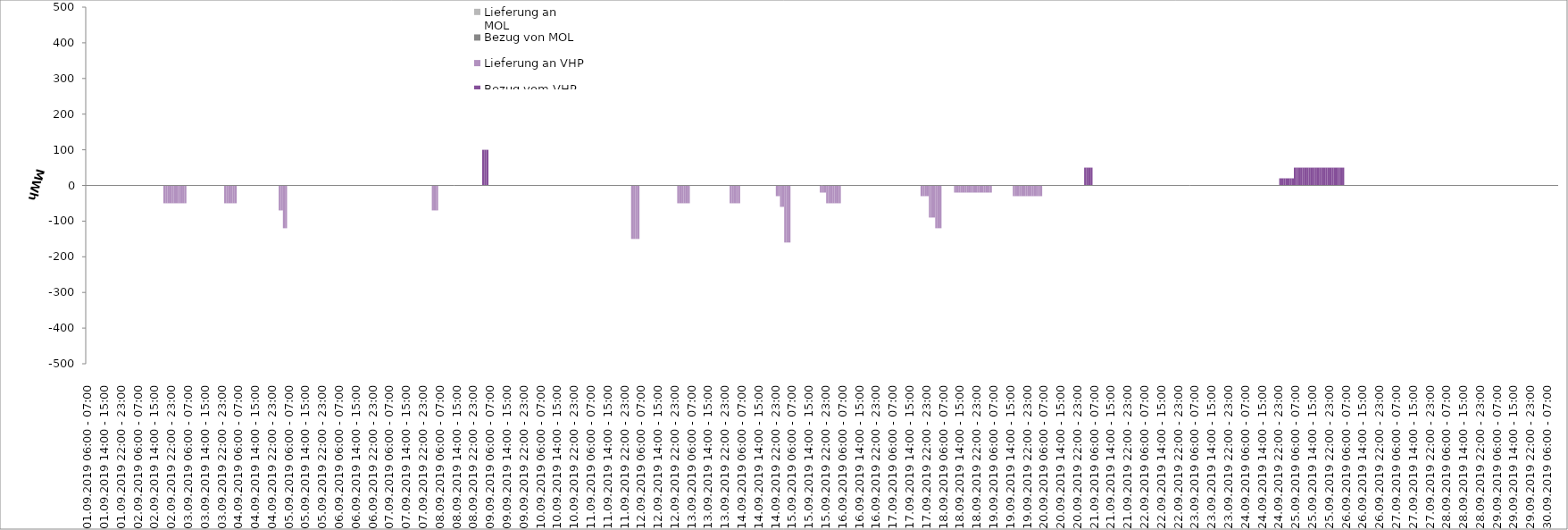
| Category | Bezug vom VHP | Lieferung an VHP | Bezug von MOL | Lieferung an MOL |
|---|---|---|---|---|
| 01.09.2019 06:00 - 07:00 | 0 | 0 | 0 | 0 |
| 01.09.2019 07:00 - 08:00 | 0 | 0 | 0 | 0 |
| 01.09.2019 08:00 - 09:00 | 0 | 0 | 0 | 0 |
| 01.09.2019 09:00 - 10:00 | 0 | 0 | 0 | 0 |
| 01.09.2019 10:00 - 11:00 | 0 | 0 | 0 | 0 |
| 01.09.2019 11:00 - 12:00 | 0 | 0 | 0 | 0 |
| 01.09.2019 12:00 - 13:00 | 0 | 0 | 0 | 0 |
| 01.09.2019 13:00 - 14:00 | 0 | 0 | 0 | 0 |
| 01.09.2019 14:00 - 15:00 | 0 | 0 | 0 | 0 |
| 01.09.2019 15:00 - 16:00 | 0 | 0 | 0 | 0 |
| 01.09.2019 16:00 - 17:00 | 0 | 0 | 0 | 0 |
| 01.09.2019 17:00 - 18:00 | 0 | 0 | 0 | 0 |
| 01.09.2019 18:00 - 19:00 | 0 | 0 | 0 | 0 |
| 01.09.2019 19:00 - 20:00 | 0 | 0 | 0 | 0 |
| 01.09.2019 20:00 - 21:00 | 0 | 0 | 0 | 0 |
| 01.09.2019 21:00 - 22:00 | 0 | 0 | 0 | 0 |
| 01.09.2019 22:00 - 23:00 | 0 | 0 | 0 | 0 |
| 01.09.2019 23:00 - 24:00 | 0 | 0 | 0 | 0 |
| 02.09.2019 00:00 - 01:00 | 0 | 0 | 0 | 0 |
| 02.09.2019 01:00 - 02:00 | 0 | 0 | 0 | 0 |
| 02.09.2019 02:00 - 03:00 | 0 | 0 | 0 | 0 |
| 02.09.2019 03:00 - 04:00 | 0 | 0 | 0 | 0 |
| 02.09.2019 04:00 - 05:00 | 0 | 0 | 0 | 0 |
| 02.09.2019 05:00 - 06:00 | 0 | 0 | 0 | 0 |
| 02.09.2019 06:00 - 07:00 | 0 | 0 | 0 | 0 |
| 02.09.2019 07:00 - 08:00 | 0 | 0 | 0 | 0 |
| 02.09.2019 08:00 - 09:00 | 0 | 0 | 0 | 0 |
| 02.09.2019 09:00 - 10:00 | 0 | 0 | 0 | 0 |
| 02.09.2019 10:00 - 11:00 | 0 | 0 | 0 | 0 |
| 02.09.2019 11:00 - 12:00 | 0 | 0 | 0 | 0 |
| 02.09.2019 12:00 - 13:00 | 0 | 0 | 0 | 0 |
| 02.09.2019 13:00 - 14:00 | 0 | 0 | 0 | 0 |
| 02.09.2019 14:00 - 15:00 | 0 | 0 | 0 | 0 |
| 02.09.2019 15:00 - 16:00 | 0 | 0 | 0 | 0 |
| 02.09.2019 16:00 - 17:00 | 0 | 0 | 0 | 0 |
| 02.09.2019 17:00 - 18:00 | 0 | 0 | 0 | 0 |
| 02.09.2019 18:00 - 19:00 | 0 | 0 | 0 | 0 |
| 02.09.2019 19:00 - 20:00 | 0 | -50 | 0 | 0 |
| 02.09.2019 20:00 - 21:00 | 0 | -50 | 0 | 0 |
| 02.09.2019 21:00 - 22:00 | 0 | -50 | 0 | 0 |
| 02.09.2019 22:00 - 23:00 | 0 | -50 | 0 | 0 |
| 02.09.2019 23:00 - 24:00 | 0 | -50 | 0 | 0 |
| 03.09.2019 00:00 - 01:00 | 0 | -50 | 0 | 0 |
| 03.09.2019 01:00 - 02:00 | 0 | -50 | 0 | 0 |
| 03.09.2019 02:00 - 03:00 | 0 | -50 | 0 | 0 |
| 03.09.2019 03:00 - 04:00 | 0 | -50 | 0 | 0 |
| 03.09.2019 04:00 - 05:00 | 0 | -50 | 0 | 0 |
| 03.09.2019 05:00 - 06:00 | 0 | -50 | 0 | 0 |
| 03.09.2019 06:00 - 07:00 | 0 | 0 | 0 | 0 |
| 03.09.2019 07:00 - 08:00 | 0 | 0 | 0 | 0 |
| 03.09.2019 08:00 - 09:00 | 0 | 0 | 0 | 0 |
| 03.09.2019 09:00 - 10:00 | 0 | 0 | 0 | 0 |
| 03.09.2019 10:00 - 11:00 | 0 | 0 | 0 | 0 |
| 03.09.2019 11:00 - 12:00 | 0 | 0 | 0 | 0 |
| 03.09.2019 12:00 - 13:00 | 0 | 0 | 0 | 0 |
| 03.09.2019 13:00 - 14:00 | 0 | 0 | 0 | 0 |
| 03.09.2019 14:00 - 15:00 | 0 | 0 | 0 | 0 |
| 03.09.2019 15:00 - 16:00 | 0 | 0 | 0 | 0 |
| 03.09.2019 16:00 - 17:00 | 0 | 0 | 0 | 0 |
| 03.09.2019 17:00 - 18:00 | 0 | 0 | 0 | 0 |
| 03.09.2019 18:00 - 19:00 | 0 | 0 | 0 | 0 |
| 03.09.2019 19:00 - 20:00 | 0 | 0 | 0 | 0 |
| 03.09.2019 20:00 - 21:00 | 0 | 0 | 0 | 0 |
| 03.09.2019 21:00 - 22:00 | 0 | 0 | 0 | 0 |
| 03.09.2019 22:00 - 23:00 | 0 | 0 | 0 | 0 |
| 03.09.2019 23:00 - 24:00 | 0 | 0 | 0 | 0 |
| 04.09.2019 00:00 - 01:00 | 0 | -50 | 0 | 0 |
| 04.09.2019 01:00 - 02:00 | 0 | -50 | 0 | 0 |
| 04.09.2019 02:00 - 03:00 | 0 | -50 | 0 | 0 |
| 04.09.2019 03:00 - 04:00 | 0 | -50 | 0 | 0 |
| 04.09.2019 04:00 - 05:00 | 0 | -50 | 0 | 0 |
| 04.09.2019 05:00 - 06:00 | 0 | -50 | 0 | 0 |
| 04.09.2019 06:00 - 07:00 | 0 | 0 | 0 | 0 |
| 04.09.2019 07:00 - 08:00 | 0 | 0 | 0 | 0 |
| 04.09.2019 08:00 - 09:00 | 0 | 0 | 0 | 0 |
| 04.09.2019 09:00 - 10:00 | 0 | 0 | 0 | 0 |
| 04.09.2019 10:00 - 11:00 | 0 | 0 | 0 | 0 |
| 04.09.2019 11:00 - 12:00 | 0 | 0 | 0 | 0 |
| 04.09.2019 12:00 - 13:00 | 0 | 0 | 0 | 0 |
| 04.09.2019 13:00 - 14:00 | 0 | 0 | 0 | 0 |
| 04.09.2019 14:00 - 15:00 | 0 | 0 | 0 | 0 |
| 04.09.2019 15:00 - 16:00 | 0 | 0 | 0 | 0 |
| 04.09.2019 16:00 - 17:00 | 0 | 0 | 0 | 0 |
| 04.09.2019 17:00 - 18:00 | 0 | 0 | 0 | 0 |
| 04.09.2019 18:00 - 19:00 | 0 | 0 | 0 | 0 |
| 04.09.2019 19:00 - 20:00 | 0 | 0 | 0 | 0 |
| 04.09.2019 20:00 - 21:00 | 0 | 0 | 0 | 0 |
| 04.09.2019 21:00 - 22:00 | 0 | 0 | 0 | 0 |
| 04.09.2019 22:00 - 23:00 | 0 | 0 | 0 | 0 |
| 04.09.2019 23:00 - 24:00 | 0 | 0 | 0 | 0 |
| 05.09.2019 00:00 - 01:00 | 0 | 0 | 0 | 0 |
| 05.09.2019 01:00 - 02:00 | 0 | 0 | 0 | 0 |
| 05.09.2019 02:00 - 03:00 | 0 | -70 | 0 | 0 |
| 05.09.2019 03:00 - 04:00 | 0 | -70 | 0 | 0 |
| 05.09.2019 04:00 - 05:00 | 0 | -120 | 0 | 0 |
| 05.09.2019 05:00 - 06:00 | 0 | -120 | 0 | 0 |
| 05.09.2019 06:00 - 07:00 | 0 | 0 | 0 | 0 |
| 05.09.2019 07:00 - 08:00 | 0 | 0 | 0 | 0 |
| 05.09.2019 08:00 - 09:00 | 0 | 0 | 0 | 0 |
| 05.09.2019 09:00 - 10:00 | 0 | 0 | 0 | 0 |
| 05.09.2019 10:00 - 11:00 | 0 | 0 | 0 | 0 |
| 05.09.2019 11:00 - 12:00 | 0 | 0 | 0 | 0 |
| 05.09.2019 12:00 - 13:00 | 0 | 0 | 0 | 0 |
| 05.09.2019 13:00 - 14:00 | 0 | 0 | 0 | 0 |
| 05.09.2019 14:00 - 15:00 | 0 | 0 | 0 | 0 |
| 05.09.2019 15:00 - 16:00 | 0 | 0 | 0 | 0 |
| 05.09.2019 16:00 - 17:00 | 0 | 0 | 0 | 0 |
| 05.09.2019 17:00 - 18:00 | 0 | 0 | 0 | 0 |
| 05.09.2019 18:00 - 19:00 | 0 | 0 | 0 | 0 |
| 05.09.2019 19:00 - 20:00 | 0 | 0 | 0 | 0 |
| 05.09.2019 20:00 - 21:00 | 0 | 0 | 0 | 0 |
| 05.09.2019 21:00 - 22:00 | 0 | 0 | 0 | 0 |
| 05.09.2019 22:00 - 23:00 | 0 | 0 | 0 | 0 |
| 05.09.2019 23:00 - 24:00 | 0 | 0 | 0 | 0 |
| 06.09.2019 00:00 - 01:00 | 0 | 0 | 0 | 0 |
| 06.09.2019 01:00 - 02:00 | 0 | 0 | 0 | 0 |
| 06.09.2019 02:00 - 03:00 | 0 | 0 | 0 | 0 |
| 06.09.2019 03:00 - 04:00 | 0 | 0 | 0 | 0 |
| 06.09.2019 04:00 - 05:00 | 0 | 0 | 0 | 0 |
| 06.09.2019 05:00 - 06:00 | 0 | 0 | 0 | 0 |
| 06.09.2019 06:00 - 07:00 | 0 | 0 | 0 | 0 |
| 06.09.2019 07:00 - 08:00 | 0 | 0 | 0 | 0 |
| 06.09.2019 08:00 - 09:00 | 0 | 0 | 0 | 0 |
| 06.09.2019 09:00 - 10:00 | 0 | 0 | 0 | 0 |
| 06.09.2019 10:00 - 11:00 | 0 | 0 | 0 | 0 |
| 06.09.2019 11:00 - 12:00 | 0 | 0 | 0 | 0 |
| 06.09.2019 12:00 - 13:00 | 0 | 0 | 0 | 0 |
| 06.09.2019 13:00 - 14:00 | 0 | 0 | 0 | 0 |
| 06.09.2019 14:00 - 15:00 | 0 | 0 | 0 | 0 |
| 06.09.2019 15:00 - 16:00 | 0 | 0 | 0 | 0 |
| 06.09.2019 16:00 - 17:00 | 0 | 0 | 0 | 0 |
| 06.09.2019 17:00 - 18:00 | 0 | 0 | 0 | 0 |
| 06.09.2019 18:00 - 19:00 | 0 | 0 | 0 | 0 |
| 06.09.2019 19:00 - 20:00 | 0 | 0 | 0 | 0 |
| 06.09.2019 20:00 - 21:00 | 0 | 0 | 0 | 0 |
| 06.09.2019 21:00 - 22:00 | 0 | 0 | 0 | 0 |
| 06.09.2019 22:00 - 23:00 | 0 | 0 | 0 | 0 |
| 06.09.2019 23:00 - 24:00 | 0 | 0 | 0 | 0 |
| 07.09.2019 00:00 - 01:00 | 0 | 0 | 0 | 0 |
| 07.09.2019 01:00 - 02:00 | 0 | 0 | 0 | 0 |
| 07.09.2019 02:00 - 03:00 | 0 | 0 | 0 | 0 |
| 07.09.2019 03:00 - 04:00 | 0 | 0 | 0 | 0 |
| 07.09.2019 04:00 - 05:00 | 0 | 0 | 0 | 0 |
| 07.09.2019 05:00 - 06:00 | 0 | 0 | 0 | 0 |
| 07.09.2019 06:00 - 07:00 | 0 | 0 | 0 | 0 |
| 07.09.2019 07:00 - 08:00 | 0 | 0 | 0 | 0 |
| 07.09.2019 08:00 - 09:00 | 0 | 0 | 0 | 0 |
| 07.09.2019 09:00 - 10:00 | 0 | 0 | 0 | 0 |
| 07.09.2019 10:00 - 11:00 | 0 | 0 | 0 | 0 |
| 07.09.2019 11:00 - 12:00 | 0 | 0 | 0 | 0 |
| 07.09.2019 12:00 - 13:00 | 0 | 0 | 0 | 0 |
| 07.09.2019 13:00 - 14:00 | 0 | 0 | 0 | 0 |
| 07.09.2019 14:00 - 15:00 | 0 | 0 | 0 | 0 |
| 07.09.2019 15:00 - 16:00 | 0 | 0 | 0 | 0 |
| 07.09.2019 16:00 - 17:00 | 0 | 0 | 0 | 0 |
| 07.09.2019 17:00 - 18:00 | 0 | 0 | 0 | 0 |
| 07.09.2019 18:00 - 19:00 | 0 | 0 | 0 | 0 |
| 07.09.2019 19:00 - 20:00 | 0 | 0 | 0 | 0 |
| 07.09.2019 20:00 - 21:00 | 0 | 0 | 0 | 0 |
| 07.09.2019 21:00 - 22:00 | 0 | 0 | 0 | 0 |
| 07.09.2019 22:00 - 23:00 | 0 | 0 | 0 | 0 |
| 07.09.2019 23:00 - 24:00 | 0 | 0 | 0 | 0 |
| 08.09.2019 00:00 - 01:00 | 0 | 0 | 0 | 0 |
| 08.09.2019 01:00 - 02:00 | 0 | 0 | 0 | 0 |
| 08.09.2019 02:00 - 03:00 | 0 | 0 | 0 | 0 |
| 08.09.2019 03:00 - 04:00 | 0 | -70 | 0 | 0 |
| 08.09.2019 04:00 - 05:00 | 0 | -70 | 0 | 0 |
| 08.09.2019 05:00 - 06:00 | 0 | -70 | 0 | 0 |
| 08.09.2019 06:00 - 07:00 | 0 | 0 | 0 | 0 |
| 08.09.2019 07:00 - 08:00 | 0 | 0 | 0 | 0 |
| 08.09.2019 08:00 - 09:00 | 0 | 0 | 0 | 0 |
| 08.09.2019 09:00 - 10:00 | 0 | 0 | 0 | 0 |
| 08.09.2019 10:00 - 11:00 | 0 | 0 | 0 | 0 |
| 08.09.2019 11:00 - 12:00 | 0 | 0 | 0 | 0 |
| 08.09.2019 12:00 - 13:00 | 0 | 0 | 0 | 0 |
| 08.09.2019 13:00 - 14:00 | 0 | 0 | 0 | 0 |
| 08.09.2019 14:00 - 15:00 | 0 | 0 | 0 | 0 |
| 08.09.2019 15:00 - 16:00 | 0 | 0 | 0 | 0 |
| 08.09.2019 16:00 - 17:00 | 0 | 0 | 0 | 0 |
| 08.09.2019 17:00 - 18:00 | 0 | 0 | 0 | 0 |
| 08.09.2019 18:00 - 19:00 | 0 | 0 | 0 | 0 |
| 08.09.2019 19:00 - 20:00 | 0 | 0 | 0 | 0 |
| 08.09.2019 20:00 - 21:00 | 0 | 0 | 0 | 0 |
| 08.09.2019 21:00 - 22:00 | 0 | 0 | 0 | 0 |
| 08.09.2019 22:00 - 23:00 | 0 | 0 | 0 | 0 |
| 08.09.2019 23:00 - 24:00 | 0 | 0 | 0 | 0 |
| 09.09.2019 00:00 - 01:00 | 0 | 0 | 0 | 0 |
| 09.09.2019 01:00 - 02:00 | 0 | 0 | 0 | 0 |
| 09.09.2019 02:00 - 03:00 | 0 | 0 | 0 | 0 |
| 09.09.2019 03:00 - 04:00 | 100 | 0 | 0 | 0 |
| 09.09.2019 04:00 - 05:00 | 100 | 0 | 0 | 0 |
| 09.09.2019 05:00 - 06:00 | 100 | 0 | 0 | 0 |
| 09.09.2019 06:00 - 07:00 | 0 | 0 | 0 | 0 |
| 09.09.2019 07:00 - 08:00 | 0 | 0 | 0 | 0 |
| 09.09.2019 08:00 - 09:00 | 0 | 0 | 0 | 0 |
| 09.09.2019 09:00 - 10:00 | 0 | 0 | 0 | 0 |
| 09.09.2019 10:00 - 11:00 | 0 | 0 | 0 | 0 |
| 09.09.2019 11:00 - 12:00 | 0 | 0 | 0 | 0 |
| 09.09.2019 12:00 - 13:00 | 0 | 0 | 0 | 0 |
| 09.09.2019 13:00 - 14:00 | 0 | 0 | 0 | 0 |
| 09.09.2019 14:00 - 15:00 | 0 | 0 | 0 | 0 |
| 09.09.2019 15:00 - 16:00 | 0 | 0 | 0 | 0 |
| 09.09.2019 16:00 - 17:00 | 0 | 0 | 0 | 0 |
| 09.09.2019 17:00 - 18:00 | 0 | 0 | 0 | 0 |
| 09.09.2019 18:00 - 19:00 | 0 | 0 | 0 | 0 |
| 09.09.2019 19:00 - 20:00 | 0 | 0 | 0 | 0 |
| 09.09.2019 20:00 - 21:00 | 0 | 0 | 0 | 0 |
| 09.09.2019 21:00 - 22:00 | 0 | 0 | 0 | 0 |
| 09.09.2019 22:00 - 23:00 | 0 | 0 | 0 | 0 |
| 09.09.2019 23:00 - 24:00 | 0 | 0 | 0 | 0 |
| 10.09.2019 00:00 - 01:00 | 0 | 0 | 0 | 0 |
| 10.09.2019 01:00 - 02:00 | 0 | 0 | 0 | 0 |
| 10.09.2019 02:00 - 03:00 | 0 | 0 | 0 | 0 |
| 10.09.2019 03:00 - 04:00 | 0 | 0 | 0 | 0 |
| 10.09.2019 04:00 - 05:00 | 0 | 0 | 0 | 0 |
| 10.09.2019 05:00 - 06:00 | 0 | 0 | 0 | 0 |
| 10.09.2019 06:00 - 07:00 | 0 | 0 | 0 | 0 |
| 10.09.2019 07:00 - 08:00 | 0 | 0 | 0 | 0 |
| 10.09.2019 08:00 - 09:00 | 0 | 0 | 0 | 0 |
| 10.09.2019 09:00 - 10:00 | 0 | 0 | 0 | 0 |
| 10.09.2019 10:00 - 11:00 | 0 | 0 | 0 | 0 |
| 10.09.2019 11:00 - 12:00 | 0 | 0 | 0 | 0 |
| 10.09.2019 12:00 - 13:00 | 0 | 0 | 0 | 0 |
| 10.09.2019 13:00 - 14:00 | 0 | 0 | 0 | 0 |
| 10.09.2019 14:00 - 15:00 | 0 | 0 | 0 | 0 |
| 10.09.2019 15:00 - 16:00 | 0 | 0 | 0 | 0 |
| 10.09.2019 16:00 - 17:00 | 0 | 0 | 0 | 0 |
| 10.09.2019 17:00 - 18:00 | 0 | 0 | 0 | 0 |
| 10.09.2019 18:00 - 19:00 | 0 | 0 | 0 | 0 |
| 10.09.2019 19:00 - 20:00 | 0 | 0 | 0 | 0 |
| 10.09.2019 20:00 - 21:00 | 0 | 0 | 0 | 0 |
| 10.09.2019 21:00 - 22:00 | 0 | 0 | 0 | 0 |
| 10.09.2019 22:00 - 23:00 | 0 | 0 | 0 | 0 |
| 10.09.2019 23:00 - 24:00 | 0 | 0 | 0 | 0 |
| 11.09.2019 00:00 - 01:00 | 0 | 0 | 0 | 0 |
| 11.09.2019 01:00 - 02:00 | 0 | 0 | 0 | 0 |
| 11.09.2019 02:00 - 03:00 | 0 | 0 | 0 | 0 |
| 11.09.2019 03:00 - 04:00 | 0 | 0 | 0 | 0 |
| 11.09.2019 04:00 - 05:00 | 0 | 0 | 0 | 0 |
| 11.09.2019 05:00 - 06:00 | 0 | 0 | 0 | 0 |
| 11.09.2019 06:00 - 07:00 | 0 | 0 | 0 | 0 |
| 11.09.2019 07:00 - 08:00 | 0 | 0 | 0 | 0 |
| 11.09.2019 08:00 - 09:00 | 0 | 0 | 0 | 0 |
| 11.09.2019 09:00 - 10:00 | 0 | 0 | 0 | 0 |
| 11.09.2019 10:00 - 11:00 | 0 | 0 | 0 | 0 |
| 11.09.2019 11:00 - 12:00 | 0 | 0 | 0 | 0 |
| 11.09.2019 12:00 - 13:00 | 0 | 0 | 0 | 0 |
| 11.09.2019 13:00 - 14:00 | 0 | 0 | 0 | 0 |
| 11.09.2019 14:00 - 15:00 | 0 | 0 | 0 | 0 |
| 11.09.2019 15:00 - 16:00 | 0 | 0 | 0 | 0 |
| 11.09.2019 16:00 - 17:00 | 0 | 0 | 0 | 0 |
| 11.09.2019 17:00 - 18:00 | 0 | 0 | 0 | 0 |
| 11.09.2019 18:00 - 19:00 | 0 | 0 | 0 | 0 |
| 11.09.2019 19:00 - 20:00 | 0 | 0 | 0 | 0 |
| 11.09.2019 20:00 - 21:00 | 0 | 0 | 0 | 0 |
| 11.09.2019 21:00 - 22:00 | 0 | 0 | 0 | 0 |
| 11.09.2019 22:00 - 23:00 | 0 | 0 | 0 | 0 |
| 11.09.2019 23:00 - 24:00 | 0 | 0 | 0 | 0 |
| 12.09.2019 00:00 - 01:00 | 0 | 0 | 0 | 0 |
| 12.09.2019 01:00 - 02:00 | 0 | 0 | 0 | 0 |
| 12.09.2019 02:00 - 03:00 | 0 | -150 | 0 | 0 |
| 12.09.2019 03:00 - 04:00 | 0 | -150 | 0 | 0 |
| 12.09.2019 04:00 - 05:00 | 0 | -150 | 0 | 0 |
| 12.09.2019 05:00 - 06:00 | 0 | -150 | 0 | 0 |
| 12.09.2019 06:00 - 07:00 | 0 | 0 | 0 | 0 |
| 12.09.2019 07:00 - 08:00 | 0 | 0 | 0 | 0 |
| 12.09.2019 08:00 - 09:00 | 0 | 0 | 0 | 0 |
| 12.09.2019 09:00 - 10:00 | 0 | 0 | 0 | 0 |
| 12.09.2019 10:00 - 11:00 | 0 | 0 | 0 | 0 |
| 12.09.2019 11:00 - 12:00 | 0 | 0 | 0 | 0 |
| 12.09.2019 12:00 - 13:00 | 0 | 0 | 0 | 0 |
| 12.09.2019 13:00 - 14:00 | 0 | 0 | 0 | 0 |
| 12.09.2019 14:00 - 15:00 | 0 | 0 | 0 | 0 |
| 12.09.2019 15:00 - 16:00 | 0 | 0 | 0 | 0 |
| 12.09.2019 16:00 - 17:00 | 0 | 0 | 0 | 0 |
| 12.09.2019 17:00 - 18:00 | 0 | 0 | 0 | 0 |
| 12.09.2019 18:00 - 19:00 | 0 | 0 | 0 | 0 |
| 12.09.2019 19:00 - 20:00 | 0 | 0 | 0 | 0 |
| 12.09.2019 20:00 - 21:00 | 0 | 0 | 0 | 0 |
| 12.09.2019 21:00 - 22:00 | 0 | 0 | 0 | 0 |
| 12.09.2019 22:00 - 23:00 | 0 | 0 | 0 | 0 |
| 12.09.2019 23:00 - 24:00 | 0 | 0 | 0 | 0 |
| 13.09.2019 00:00 - 01:00 | 0 | -50 | 0 | 0 |
| 13.09.2019 01:00 - 02:00 | 0 | -50 | 0 | 0 |
| 13.09.2019 02:00 - 03:00 | 0 | -50 | 0 | 0 |
| 13.09.2019 03:00 - 04:00 | 0 | -50 | 0 | 0 |
| 13.09.2019 04:00 - 05:00 | 0 | -50 | 0 | 0 |
| 13.09.2019 05:00 - 06:00 | 0 | -50 | 0 | 0 |
| 13.09.2019 06:00 - 07:00 | 0 | 0 | 0 | 0 |
| 13.09.2019 07:00 - 08:00 | 0 | 0 | 0 | 0 |
| 13.09.2019 08:00 - 09:00 | 0 | 0 | 0 | 0 |
| 13.09.2019 09:00 - 10:00 | 0 | 0 | 0 | 0 |
| 13.09.2019 10:00 - 11:00 | 0 | 0 | 0 | 0 |
| 13.09.2019 11:00 - 12:00 | 0 | 0 | 0 | 0 |
| 13.09.2019 12:00 - 13:00 | 0 | 0 | 0 | 0 |
| 13.09.2019 13:00 - 14:00 | 0 | 0 | 0 | 0 |
| 13.09.2019 14:00 - 15:00 | 0 | 0 | 0 | 0 |
| 13.09.2019 15:00 - 16:00 | 0 | 0 | 0 | 0 |
| 13.09.2019 16:00 - 17:00 | 0 | 0 | 0 | 0 |
| 13.09.2019 17:00 - 18:00 | 0 | 0 | 0 | 0 |
| 13.09.2019 18:00 - 19:00 | 0 | 0 | 0 | 0 |
| 13.09.2019 19:00 - 20:00 | 0 | 0 | 0 | 0 |
| 13.09.2019 20:00 - 21:00 | 0 | 0 | 0 | 0 |
| 13.09.2019 21:00 - 22:00 | 0 | 0 | 0 | 0 |
| 13.09.2019 22:00 - 23:00 | 0 | 0 | 0 | 0 |
| 13.09.2019 23:00 - 24:00 | 0 | 0 | 0 | 0 |
| 14.09.2019 00:00 - 01:00 | 0 | 0 | 0 | 0 |
| 14.09.2019 01:00 - 02:00 | 0 | -50 | 0 | 0 |
| 14.09.2019 02:00 - 03:00 | 0 | -50 | 0 | 0 |
| 14.09.2019 03:00 - 04:00 | 0 | -50 | 0 | 0 |
| 14.09.2019 04:00 - 05:00 | 0 | -50 | 0 | 0 |
| 14.09.2019 05:00 - 06:00 | 0 | -50 | 0 | 0 |
| 14.09.2019 06:00 - 07:00 | 0 | 0 | 0 | 0 |
| 14.09.2019 07:00 - 08:00 | 0 | 0 | 0 | 0 |
| 14.09.2019 08:00 - 09:00 | 0 | 0 | 0 | 0 |
| 14.09.2019 09:00 - 10:00 | 0 | 0 | 0 | 0 |
| 14.09.2019 10:00 - 11:00 | 0 | 0 | 0 | 0 |
| 14.09.2019 11:00 - 12:00 | 0 | 0 | 0 | 0 |
| 14.09.2019 12:00 - 13:00 | 0 | 0 | 0 | 0 |
| 14.09.2019 13:00 - 14:00 | 0 | 0 | 0 | 0 |
| 14.09.2019 14:00 - 15:00 | 0 | 0 | 0 | 0 |
| 14.09.2019 15:00 - 16:00 | 0 | 0 | 0 | 0 |
| 14.09.2019 16:00 - 17:00 | 0 | 0 | 0 | 0 |
| 14.09.2019 17:00 - 18:00 | 0 | 0 | 0 | 0 |
| 14.09.2019 18:00 - 19:00 | 0 | 0 | 0 | 0 |
| 14.09.2019 19:00 - 20:00 | 0 | 0 | 0 | 0 |
| 14.09.2019 20:00 - 21:00 | 0 | 0 | 0 | 0 |
| 14.09.2019 21:00 - 22:00 | 0 | 0 | 0 | 0 |
| 14.09.2019 22:00 - 23:00 | 0 | 0 | 0 | 0 |
| 14.09.2019 23:00 - 24:00 | 0 | -30 | 0 | 0 |
| 15.09.2019 00:00 - 01:00 | 0 | -30 | 0 | 0 |
| 15.09.2019 01:00 - 02:00 | 0 | -60 | 0 | 0 |
| 15.09.2019 02:00 - 03:00 | 0 | -60 | 0 | 0 |
| 15.09.2019 03:00 - 04:00 | 0 | -160 | 0 | 0 |
| 15.09.2019 04:00 - 05:00 | 0 | -160 | 0 | 0 |
| 15.09.2019 05:00 - 06:00 | 0 | -160 | 0 | 0 |
| 15.09.2019 06:00 - 07:00 | 0 | 0 | 0 | 0 |
| 15.09.2019 07:00 - 08:00 | 0 | 0 | 0 | 0 |
| 15.09.2019 08:00 - 09:00 | 0 | 0 | 0 | 0 |
| 15.09.2019 09:00 - 10:00 | 0 | 0 | 0 | 0 |
| 15.09.2019 10:00 - 11:00 | 0 | 0 | 0 | 0 |
| 15.09.2019 11:00 - 12:00 | 0 | 0 | 0 | 0 |
| 15.09.2019 12:00 - 13:00 | 0 | 0 | 0 | 0 |
| 15.09.2019 13:00 - 14:00 | 0 | 0 | 0 | 0 |
| 15.09.2019 14:00 - 15:00 | 0 | 0 | 0 | 0 |
| 15.09.2019 15:00 - 16:00 | 0 | 0 | 0 | 0 |
| 15.09.2019 16:00 - 17:00 | 0 | 0 | 0 | 0 |
| 15.09.2019 17:00 - 18:00 | 0 | 0 | 0 | 0 |
| 15.09.2019 18:00 - 19:00 | 0 | 0 | 0 | 0 |
| 15.09.2019 19:00 - 20:00 | 0 | 0 | 0 | 0 |
| 15.09.2019 20:00 - 21:00 | 0 | -20 | 0 | 0 |
| 15.09.2019 21:00 - 22:00 | 0 | -20 | 0 | 0 |
| 15.09.2019 22:00 - 23:00 | 0 | -20 | 0 | 0 |
| 15.09.2019 23:00 - 24:00 | 0 | -50 | 0 | 0 |
| 16.09.2019 00:00 - 01:00 | 0 | -50 | 0 | 0 |
| 16.09.2019 01:00 - 02:00 | 0 | -50 | 0 | 0 |
| 16.09.2019 02:00 - 03:00 | 0 | -50 | 0 | 0 |
| 16.09.2019 03:00 - 04:00 | 0 | -50 | 0 | 0 |
| 16.09.2019 04:00 - 05:00 | 0 | -50 | 0 | 0 |
| 16.09.2019 05:00 - 06:00 | 0 | -50 | 0 | 0 |
| 16.09.2019 06:00 - 07:00 | 0 | 0 | 0 | 0 |
| 16.09.2019 07:00 - 08:00 | 0 | 0 | 0 | 0 |
| 16.09.2019 08:00 - 09:00 | 0 | 0 | 0 | 0 |
| 16.09.2019 09:00 - 10:00 | 0 | 0 | 0 | 0 |
| 16.09.2019 10:00 - 11:00 | 0 | 0 | 0 | 0 |
| 16.09.2019 11:00 - 12:00 | 0 | 0 | 0 | 0 |
| 16.09.2019 12:00 - 13:00 | 0 | 0 | 0 | 0 |
| 16.09.2019 13:00 - 14:00 | 0 | 0 | 0 | 0 |
| 16.09.2019 14:00 - 15:00 | 0 | 0 | 0 | 0 |
| 16.09.2019 15:00 - 16:00 | 0 | 0 | 0 | 0 |
| 16.09.2019 16:00 - 17:00 | 0 | 0 | 0 | 0 |
| 16.09.2019 17:00 - 18:00 | 0 | 0 | 0 | 0 |
| 16.09.2019 18:00 - 19:00 | 0 | 0 | 0 | 0 |
| 16.09.2019 19:00 - 20:00 | 0 | 0 | 0 | 0 |
| 16.09.2019 20:00 - 21:00 | 0 | 0 | 0 | 0 |
| 16.09.2019 21:00 - 22:00 | 0 | 0 | 0 | 0 |
| 16.09.2019 22:00 - 23:00 | 0 | 0 | 0 | 0 |
| 16.09.2019 23:00 - 24:00 | 0 | 0 | 0 | 0 |
| 17.09.2019 00:00 - 01:00 | 0 | 0 | 0 | 0 |
| 17.09.2019 01:00 - 02:00 | 0 | 0 | 0 | 0 |
| 17.09.2019 02:00 - 03:00 | 0 | 0 | 0 | 0 |
| 17.09.2019 03:00 - 04:00 | 0 | 0 | 0 | 0 |
| 17.09.2019 04:00 - 05:00 | 0 | 0 | 0 | 0 |
| 17.09.2019 05:00 - 06:00 | 0 | 0 | 0 | 0 |
| 17.09.2019 06:00 - 07:00 | 0 | 0 | 0 | 0 |
| 17.09.2019 07:00 - 08:00 | 0 | 0 | 0 | 0 |
| 17.09.2019 08:00 - 09:00 | 0 | 0 | 0 | 0 |
| 17.09.2019 09:00 - 10:00 | 0 | 0 | 0 | 0 |
| 17.09.2019 10:00 - 11:00 | 0 | 0 | 0 | 0 |
| 17.09.2019 11:00 - 12:00 | 0 | 0 | 0 | 0 |
| 17.09.2019 12:00 - 13:00 | 0 | 0 | 0 | 0 |
| 17.09.2019 13:00 - 14:00 | 0 | 0 | 0 | 0 |
| 17.09.2019 14:00 - 15:00 | 0 | 0 | 0 | 0 |
| 17.09.2019 15:00 - 16:00 | 0 | 0 | 0 | 0 |
| 17.09.2019 16:00 - 17:00 | 0 | 0 | 0 | 0 |
| 17.09.2019 17:00 - 18:00 | 0 | 0 | 0 | 0 |
| 17.09.2019 18:00 - 19:00 | 0 | 0 | 0 | 0 |
| 17.09.2019 19:00 - 20:00 | 0 | 0 | 0 | 0 |
| 17.09.2019 20:00 - 21:00 | 0 | -30 | 0 | 0 |
| 17.09.2019 21:00 - 22:00 | 0 | -30 | 0 | 0 |
| 17.09.2019 22:00 - 23:00 | 0 | -30 | 0 | 0 |
| 17.09.2019 23:00 - 24:00 | 0 | -30 | 0 | 0 |
| 18.09.2019 00:00 - 01:00 | 0 | -90 | 0 | 0 |
| 18.09.2019 01:00 - 02:00 | 0 | -90 | 0 | 0 |
| 18.09.2019 02:00 - 03:00 | 0 | -90 | 0 | 0 |
| 18.09.2019 03:00 - 04:00 | 0 | -120 | 0 | 0 |
| 18.09.2019 04:00 - 05:00 | 0 | -120 | 0 | 0 |
| 18.09.2019 05:00 - 06:00 | 0 | -120 | 0 | 0 |
| 18.09.2019 06:00 - 07:00 | 0 | 0 | 0 | 0 |
| 18.09.2019 07:00 - 08:00 | 0 | 0 | 0 | 0 |
| 18.09.2019 08:00 - 09:00 | 0 | 0 | 0 | 0 |
| 18.09.2019 09:00 - 10:00 | 0 | 0 | 0 | 0 |
| 18.09.2019 10:00 - 11:00 | 0 | 0 | 0 | 0 |
| 18.09.2019 11:00 - 12:00 | 0 | 0 | 0 | 0 |
| 18.09.2019 12:00 - 13:00 | 0 | -20 | 0 | 0 |
| 18.09.2019 13:00 - 14:00 | 0 | -20 | 0 | 0 |
| 18.09.2019 14:00 - 15:00 | 0 | -20 | 0 | 0 |
| 18.09.2019 15:00 - 16:00 | 0 | -20 | 0 | 0 |
| 18.09.2019 16:00 - 17:00 | 0 | -20 | 0 | 0 |
| 18.09.2019 17:00 - 18:00 | 0 | -20 | 0 | 0 |
| 18.09.2019 18:00 - 19:00 | 0 | -20 | 0 | 0 |
| 18.09.2019 19:00 - 20:00 | 0 | -20 | 0 | 0 |
| 18.09.2019 20:00 - 21:00 | 0 | -20 | 0 | 0 |
| 18.09.2019 21:00 - 22:00 | 0 | -20 | 0 | 0 |
| 18.09.2019 22:00 - 23:00 | 0 | -20 | 0 | 0 |
| 18.09.2019 23:00 - 24:00 | 0 | -20 | 0 | 0 |
| 19.09.2019 00:00 - 01:00 | 0 | -20 | 0 | 0 |
| 19.09.2019 01:00 - 02:00 | 0 | -20 | 0 | 0 |
| 19.09.2019 02:00 - 03:00 | 0 | -20 | 0 | 0 |
| 19.09.2019 03:00 - 04:00 | 0 | -20 | 0 | 0 |
| 19.09.2019 04:00 - 05:00 | 0 | -20 | 0 | 0 |
| 19.09.2019 05:00 - 06:00 | 0 | -20 | 0 | 0 |
| 19.09.2019 06:00 - 07:00 | 0 | 0 | 0 | 0 |
| 19.09.2019 07:00 - 08:00 | 0 | 0 | 0 | 0 |
| 19.09.2019 08:00 - 09:00 | 0 | 0 | 0 | 0 |
| 19.09.2019 09:00 - 10:00 | 0 | 0 | 0 | 0 |
| 19.09.2019 10:00 - 11:00 | 0 | 0 | 0 | 0 |
| 19.09.2019 11:00 - 12:00 | 0 | 0 | 0 | 0 |
| 19.09.2019 12:00 - 13:00 | 0 | 0 | 0 | 0 |
| 19.09.2019 13:00 - 14:00 | 0 | 0 | 0 | 0 |
| 19.09.2019 14:00 - 15:00 | 0 | 0 | 0 | 0 |
| 19.09.2019 15:00 - 16:00 | 0 | 0 | 0 | 0 |
| 19.09.2019 16:00 - 17:00 | 0 | -30 | 0 | 0 |
| 19.09.2019 17:00 - 18:00 | 0 | -30 | 0 | 0 |
| 19.09.2019 18:00 - 19:00 | 0 | -30 | 0 | 0 |
| 19.09.2019 19:00 - 20:00 | 0 | -30 | 0 | 0 |
| 19.09.2019 20:00 - 21:00 | 0 | -30 | 0 | 0 |
| 19.09.2019 21:00 - 22:00 | 0 | -30 | 0 | 0 |
| 19.09.2019 22:00 - 23:00 | 0 | -30 | 0 | 0 |
| 19.09.2019 23:00 - 24:00 | 0 | -30 | 0 | 0 |
| 20.09.2019 00:00 - 01:00 | 0 | -30 | 0 | 0 |
| 20.09.2019 01:00 - 02:00 | 0 | -30 | 0 | 0 |
| 20.09.2019 02:00 - 03:00 | 0 | -30 | 0 | 0 |
| 20.09.2019 03:00 - 04:00 | 0 | -30 | 0 | 0 |
| 20.09.2019 04:00 - 05:00 | 0 | -30 | 0 | 0 |
| 20.09.2019 05:00 - 06:00 | 0 | -30 | 0 | 0 |
| 20.09.2019 06:00 - 07:00 | 0 | 0 | 0 | 0 |
| 20.09.2019 07:00 - 08:00 | 0 | 0 | 0 | 0 |
| 20.09.2019 08:00 - 09:00 | 0 | 0 | 0 | 0 |
| 20.09.2019 09:00 - 10:00 | 0 | 0 | 0 | 0 |
| 20.09.2019 10:00 - 11:00 | 0 | 0 | 0 | 0 |
| 20.09.2019 11:00 - 12:00 | 0 | 0 | 0 | 0 |
| 20.09.2019 12:00 - 13:00 | 0 | 0 | 0 | 0 |
| 20.09.2019 13:00 - 14:00 | 0 | 0 | 0 | 0 |
| 20.09.2019 14:00 - 15:00 | 0 | 0 | 0 | 0 |
| 20.09.2019 15:00 - 16:00 | 0 | 0 | 0 | 0 |
| 20.09.2019 16:00 - 17:00 | 0 | 0 | 0 | 0 |
| 20.09.2019 17:00 - 18:00 | 0 | 0 | 0 | 0 |
| 20.09.2019 18:00 - 19:00 | 0 | 0 | 0 | 0 |
| 20.09.2019 19:00 - 20:00 | 0 | 0 | 0 | 0 |
| 20.09.2019 20:00 - 21:00 | 0 | 0 | 0 | 0 |
| 20.09.2019 21:00 - 22:00 | 0 | 0 | 0 | 0 |
| 20.09.2019 22:00 - 23:00 | 0 | 0 | 0 | 0 |
| 20.09.2019 23:00 - 24:00 | 0 | 0 | 0 | 0 |
| 21.09.2019 00:00 - 01:00 | 0 | 0 | 0 | 0 |
| 21.09.2019 01:00 - 02:00 | 0 | 0 | 0 | 0 |
| 21.09.2019 02:00 - 03:00 | 50 | 0 | 0 | 0 |
| 21.09.2019 03:00 - 04:00 | 50 | 0 | 0 | 0 |
| 21.09.2019 04:00 - 05:00 | 50 | 0 | 0 | 0 |
| 21.09.2019 05:00 - 06:00 | 50 | 0 | 0 | 0 |
| 21.09.2019 06:00 - 07:00 | 0 | 0 | 0 | 0 |
| 21.09.2019 07:00 - 08:00 | 0 | 0 | 0 | 0 |
| 21.09.2019 08:00 - 09:00 | 0 | 0 | 0 | 0 |
| 21.09.2019 09:00 - 10:00 | 0 | 0 | 0 | 0 |
| 21.09.2019 10:00 - 11:00 | 0 | 0 | 0 | 0 |
| 21.09.2019 11:00 - 12:00 | 0 | 0 | 0 | 0 |
| 21.09.2019 12:00 - 13:00 | 0 | 0 | 0 | 0 |
| 21.09.2019 13:00 - 14:00 | 0 | 0 | 0 | 0 |
| 21.09.2019 14:00 - 15:00 | 0 | 0 | 0 | 0 |
| 21.09.2019 15:00 - 16:00 | 0 | 0 | 0 | 0 |
| 21.09.2019 16:00 - 17:00 | 0 | 0 | 0 | 0 |
| 21.09.2019 17:00 - 18:00 | 0 | 0 | 0 | 0 |
| 21.09.2019 18:00 - 19:00 | 0 | 0 | 0 | 0 |
| 21.09.2019 19:00 - 20:00 | 0 | 0 | 0 | 0 |
| 21.09.2019 20:00 - 21:00 | 0 | 0 | 0 | 0 |
| 21.09.2019 21:00 - 22:00 | 0 | 0 | 0 | 0 |
| 21.09.2019 22:00 - 23:00 | 0 | 0 | 0 | 0 |
| 21.09.2019 23:00 - 24:00 | 0 | 0 | 0 | 0 |
| 22.09.2019 00:00 - 01:00 | 0 | 0 | 0 | 0 |
| 22.09.2019 01:00 - 02:00 | 0 | 0 | 0 | 0 |
| 22.09.2019 02:00 - 03:00 | 0 | 0 | 0 | 0 |
| 22.09.2019 03:00 - 04:00 | 0 | 0 | 0 | 0 |
| 22.09.2019 04:00 - 05:00 | 0 | 0 | 0 | 0 |
| 22.09.2019 05:00 - 06:00 | 0 | 0 | 0 | 0 |
| 22.09.2019 06:00 - 07:00 | 0 | 0 | 0 | 0 |
| 22.09.2019 07:00 - 08:00 | 0 | 0 | 0 | 0 |
| 22.09.2019 08:00 - 09:00 | 0 | 0 | 0 | 0 |
| 22.09.2019 09:00 - 10:00 | 0 | 0 | 0 | 0 |
| 22.09.2019 10:00 - 11:00 | 0 | 0 | 0 | 0 |
| 22.09.2019 11:00 - 12:00 | 0 | 0 | 0 | 0 |
| 22.09.2019 12:00 - 13:00 | 0 | 0 | 0 | 0 |
| 22.09.2019 13:00 - 14:00 | 0 | 0 | 0 | 0 |
| 22.09.2019 14:00 - 15:00 | 0 | 0 | 0 | 0 |
| 22.09.2019 15:00 - 16:00 | 0 | 0 | 0 | 0 |
| 22.09.2019 16:00 - 17:00 | 0 | 0 | 0 | 0 |
| 22.09.2019 17:00 - 18:00 | 0 | 0 | 0 | 0 |
| 22.09.2019 18:00 - 19:00 | 0 | 0 | 0 | 0 |
| 22.09.2019 19:00 - 20:00 | 0 | 0 | 0 | 0 |
| 22.09.2019 20:00 - 21:00 | 0 | 0 | 0 | 0 |
| 22.09.2019 21:00 - 22:00 | 0 | 0 | 0 | 0 |
| 22.09.2019 22:00 - 23:00 | 0 | 0 | 0 | 0 |
| 22.09.2019 23:00 - 24:00 | 0 | 0 | 0 | 0 |
| 23.09.2019 00:00 - 01:00 | 0 | 0 | 0 | 0 |
| 23.09.2019 01:00 - 02:00 | 0 | 0 | 0 | 0 |
| 23.09.2019 02:00 - 03:00 | 0 | 0 | 0 | 0 |
| 23.09.2019 03:00 - 04:00 | 0 | 0 | 0 | 0 |
| 23.09.2019 04:00 - 05:00 | 0 | 0 | 0 | 0 |
| 23.09.2019 05:00 - 06:00 | 0 | 0 | 0 | 0 |
| 23.09.2019 06:00 - 07:00 | 0 | 0 | 0 | 0 |
| 23.09.2019 07:00 - 08:00 | 0 | 0 | 0 | 0 |
| 23.09.2019 08:00 - 09:00 | 0 | 0 | 0 | 0 |
| 23.09.2019 09:00 - 10:00 | 0 | 0 | 0 | 0 |
| 23.09.2019 10:00 - 11:00 | 0 | 0 | 0 | 0 |
| 23.09.2019 11:00 - 12:00 | 0 | 0 | 0 | 0 |
| 23.09.2019 12:00 - 13:00 | 0 | 0 | 0 | 0 |
| 23.09.2019 13:00 - 14:00 | 0 | 0 | 0 | 0 |
| 23.09.2019 14:00 - 15:00 | 0 | 0 | 0 | 0 |
| 23.09.2019 15:00 - 16:00 | 0 | 0 | 0 | 0 |
| 23.09.2019 16:00 - 17:00 | 0 | 0 | 0 | 0 |
| 23.09.2019 17:00 - 18:00 | 0 | 0 | 0 | 0 |
| 23.09.2019 18:00 - 19:00 | 0 | 0 | 0 | 0 |
| 23.09.2019 19:00 - 20:00 | 0 | 0 | 0 | 0 |
| 23.09.2019 20:00 - 21:00 | 0 | 0 | 0 | 0 |
| 23.09.2019 21:00 - 22:00 | 0 | 0 | 0 | 0 |
| 23.09.2019 22:00 - 23:00 | 0 | 0 | 0 | 0 |
| 23.09.2019 23:00 - 24:00 | 0 | 0 | 0 | 0 |
| 24.09.2019 00:00 - 01:00 | 0 | 0 | 0 | 0 |
| 24.09.2019 01:00 - 02:00 | 0 | 0 | 0 | 0 |
| 24.09.2019 02:00 - 03:00 | 0 | 0 | 0 | 0 |
| 24.09.2019 03:00 - 04:00 | 0 | 0 | 0 | 0 |
| 24.09.2019 04:00 - 05:00 | 0 | 0 | 0 | 0 |
| 24.09.2019 05:00 - 06:00 | 0 | 0 | 0 | 0 |
| 24.09.2019 06:00 - 07:00 | 0 | 0 | 0 | 0 |
| 24.09.2019 07:00 - 08:00 | 0 | 0 | 0 | 0 |
| 24.09.2019 08:00 - 09:00 | 0 | 0 | 0 | 0 |
| 24.09.2019 09:00 - 10:00 | 0 | 0 | 0 | 0 |
| 24.09.2019 10:00 - 11:00 | 0 | 0 | 0 | 0 |
| 24.09.2019 11:00 - 12:00 | 0 | 0 | 0 | 0 |
| 24.09.2019 12:00 - 13:00 | 0 | 0 | 0 | 0 |
| 24.09.2019 13:00 - 14:00 | 0 | 0 | 0 | 0 |
| 24.09.2019 14:00 - 15:00 | 0 | 0 | 0 | 0 |
| 24.09.2019 15:00 - 16:00 | 0 | 0 | 0 | 0 |
| 24.09.2019 16:00 - 17:00 | 0 | 0 | 0 | 0 |
| 24.09.2019 17:00 - 18:00 | 0 | 0 | 0 | 0 |
| 24.09.2019 18:00 - 19:00 | 0 | 0 | 0 | 0 |
| 24.09.2019 19:00 - 20:00 | 0 | 0 | 0 | 0 |
| 24.09.2019 20:00 - 21:00 | 0 | 0 | 0 | 0 |
| 24.09.2019 21:00 - 22:00 | 0 | 0 | 0 | 0 |
| 24.09.2019 22:00 - 23:00 | 0 | 0 | 0 | 0 |
| 24.09.2019 23:00 - 24:00 | 20 | 0 | 0 | 0 |
| 25.09.2019 00:00 - 01:00 | 20 | 0 | 0 | 0 |
| 25.09.2019 01:00 - 02:00 | 20 | 0 | 0 | 0 |
| 25.09.2019 02:00 - 03:00 | 20 | 0 | 0 | 0 |
| 25.09.2019 03:00 - 04:00 | 20 | 0 | 0 | 0 |
| 25.09.2019 04:00 - 05:00 | 20 | 0 | 0 | 0 |
| 25.09.2019 05:00 - 06:00 | 20 | 0 | 0 | 0 |
| 25.09.2019 06:00 - 07:00 | 50 | 0 | 0 | 0 |
| 25.09.2019 07:00 - 08:00 | 50 | 0 | 0 | 0 |
| 25.09.2019 08:00 - 09:00 | 50 | 0 | 0 | 0 |
| 25.09.2019 09:00 - 10:00 | 50 | 0 | 0 | 0 |
| 25.09.2019 10:00 - 11:00 | 50 | 0 | 0 | 0 |
| 25.09.2019 11:00 - 12:00 | 50 | 0 | 0 | 0 |
| 25.09.2019 12:00 - 13:00 | 50 | 0 | 0 | 0 |
| 25.09.2019 13:00 - 14:00 | 50 | 0 | 0 | 0 |
| 25.09.2019 14:00 - 15:00 | 50 | 0 | 0 | 0 |
| 25.09.2019 15:00 - 16:00 | 50 | 0 | 0 | 0 |
| 25.09.2019 16:00 - 17:00 | 50 | 0 | 0 | 0 |
| 25.09.2019 17:00 - 18:00 | 50 | 0 | 0 | 0 |
| 25.09.2019 18:00 - 19:00 | 50 | 0 | 0 | 0 |
| 25.09.2019 19:00 - 20:00 | 50 | 0 | 0 | 0 |
| 25.09.2019 20:00 - 21:00 | 50 | 0 | 0 | 0 |
| 25.09.2019 21:00 - 22:00 | 50 | 0 | 0 | 0 |
| 25.09.2019 22:00 - 23:00 | 50 | 0 | 0 | 0 |
| 25.09.2019 23:00 - 24:00 | 50 | 0 | 0 | 0 |
| 26.09.2019 00:00 - 01:00 | 50 | 0 | 0 | 0 |
| 26.09.2019 01:00 - 02:00 | 50 | 0 | 0 | 0 |
| 26.09.2019 02:00 - 03:00 | 50 | 0 | 0 | 0 |
| 26.09.2019 03:00 - 04:00 | 50 | 0 | 0 | 0 |
| 26.09.2019 04:00 - 05:00 | 50 | 0 | 0 | 0 |
| 26.09.2019 05:00 - 06:00 | 50 | 0 | 0 | 0 |
| 26.09.2019 06:00 - 07:00 | 0 | 0 | 0 | 0 |
| 26.09.2019 07:00 - 08:00 | 0 | 0 | 0 | 0 |
| 26.09.2019 08:00 - 09:00 | 0 | 0 | 0 | 0 |
| 26.09.2019 09:00 - 10:00 | 0 | 0 | 0 | 0 |
| 26.09.2019 10:00 - 11:00 | 0 | 0 | 0 | 0 |
| 26.09.2019 11:00 - 12:00 | 0 | 0 | 0 | 0 |
| 26.09.2019 12:00 - 13:00 | 0 | 0 | 0 | 0 |
| 26.09.2019 13:00 - 14:00 | 0 | 0 | 0 | 0 |
| 26.09.2019 14:00 - 15:00 | 0 | 0 | 0 | 0 |
| 26.09.2019 15:00 - 16:00 | 0 | 0 | 0 | 0 |
| 26.09.2019 16:00 - 17:00 | 0 | 0 | 0 | 0 |
| 26.09.2019 17:00 - 18:00 | 0 | 0 | 0 | 0 |
| 26.09.2019 18:00 - 19:00 | 0 | 0 | 0 | 0 |
| 26.09.2019 19:00 - 20:00 | 0 | 0 | 0 | 0 |
| 26.09.2019 20:00 - 21:00 | 0 | 0 | 0 | 0 |
| 26.09.2019 21:00 - 22:00 | 0 | 0 | 0 | 0 |
| 26.09.2019 22:00 - 23:00 | 0 | 0 | 0 | 0 |
| 26.09.2019 23:00 - 24:00 | 0 | 0 | 0 | 0 |
| 27.09.2019 00:00 - 01:00 | 0 | 0 | 0 | 0 |
| 27.09.2019 01:00 - 02:00 | 0 | 0 | 0 | 0 |
| 27.09.2019 02:00 - 03:00 | 0 | 0 | 0 | 0 |
| 27.09.2019 03:00 - 04:00 | 0 | 0 | 0 | 0 |
| 27.09.2019 04:00 - 05:00 | 0 | 0 | 0 | 0 |
| 27.09.2019 05:00 - 06:00 | 0 | 0 | 0 | 0 |
| 27.09.2019 06:00 - 07:00 | 0 | 0 | 0 | 0 |
| 27.09.2019 07:00 - 08:00 | 0 | 0 | 0 | 0 |
| 27.09.2019 08:00 - 09:00 | 0 | 0 | 0 | 0 |
| 27.09.2019 09:00 - 10:00 | 0 | 0 | 0 | 0 |
| 27.09.2019 10:00 - 11:00 | 0 | 0 | 0 | 0 |
| 27.09.2019 11:00 - 12:00 | 0 | 0 | 0 | 0 |
| 27.09.2019 12:00 - 13:00 | 0 | 0 | 0 | 0 |
| 27.09.2019 13:00 - 14:00 | 0 | 0 | 0 | 0 |
| 27.09.2019 14:00 - 15:00 | 0 | 0 | 0 | 0 |
| 27.09.2019 15:00 - 16:00 | 0 | 0 | 0 | 0 |
| 27.09.2019 16:00 - 17:00 | 0 | 0 | 0 | 0 |
| 27.09.2019 17:00 - 18:00 | 0 | 0 | 0 | 0 |
| 27.09.2019 18:00 - 19:00 | 0 | 0 | 0 | 0 |
| 27.09.2019 19:00 - 20:00 | 0 | 0 | 0 | 0 |
| 27.09.2019 20:00 - 21:00 | 0 | 0 | 0 | 0 |
| 27.09.2019 21:00 - 22:00 | 0 | 0 | 0 | 0 |
| 27.09.2019 22:00 - 23:00 | 0 | 0 | 0 | 0 |
| 27.09.2019 23:00 - 24:00 | 0 | 0 | 0 | 0 |
| 28.09.2019 00:00 - 01:00 | 0 | 0 | 0 | 0 |
| 28.09.2019 01:00 - 02:00 | 0 | 0 | 0 | 0 |
| 28.09.2019 02:00 - 03:00 | 0 | 0 | 0 | 0 |
| 28.09.2019 03:00 - 04:00 | 0 | 0 | 0 | 0 |
| 28.09.2019 04:00 - 05:00 | 0 | 0 | 0 | 0 |
| 28.09.2019 05:00 - 06:00 | 0 | 0 | 0 | 0 |
| 28.09.2019 06:00 - 07:00 | 0 | 0 | 0 | 0 |
| 28.09.2019 07:00 - 08:00 | 0 | 0 | 0 | 0 |
| 28.09.2019 08:00 - 09:00 | 0 | 0 | 0 | 0 |
| 28.09.2019 09:00 - 10:00 | 0 | 0 | 0 | 0 |
| 28.09.2019 10:00 - 11:00 | 0 | 0 | 0 | 0 |
| 28.09.2019 11:00 - 12:00 | 0 | 0 | 0 | 0 |
| 28.09.2019 12:00 - 13:00 | 0 | 0 | 0 | 0 |
| 28.09.2019 13:00 - 14:00 | 0 | 0 | 0 | 0 |
| 28.09.2019 14:00 - 15:00 | 0 | 0 | 0 | 0 |
| 28.09.2019 15:00 - 16:00 | 0 | 0 | 0 | 0 |
| 28.09.2019 16:00 - 17:00 | 0 | 0 | 0 | 0 |
| 28.09.2019 17:00 - 18:00 | 0 | 0 | 0 | 0 |
| 28.09.2019 18:00 - 19:00 | 0 | 0 | 0 | 0 |
| 28.09.2019 19:00 - 20:00 | 0 | 0 | 0 | 0 |
| 28.09.2019 20:00 - 21:00 | 0 | 0 | 0 | 0 |
| 28.09.2019 21:00 - 22:00 | 0 | 0 | 0 | 0 |
| 28.09.2019 22:00 - 23:00 | 0 | 0 | 0 | 0 |
| 28.09.2019 23:00 - 24:00 | 0 | 0 | 0 | 0 |
| 29.09.2019 00:00 - 01:00 | 0 | 0 | 0 | 0 |
| 29.09.2019 01:00 - 02:00 | 0 | 0 | 0 | 0 |
| 29.09.2019 02:00 - 03:00 | 0 | 0 | 0 | 0 |
| 29.09.2019 03:00 - 04:00 | 0 | 0 | 0 | 0 |
| 29.09.2019 04:00 - 05:00 | 0 | 0 | 0 | 0 |
| 29.09.2019 05:00 - 06:00 | 0 | 0 | 0 | 0 |
| 29.09.2019 06:00 - 07:00 | 0 | 0 | 0 | 0 |
| 29.09.2019 07:00 - 08:00 | 0 | 0 | 0 | 0 |
| 29.09.2019 08:00 - 09:00 | 0 | 0 | 0 | 0 |
| 29.09.2019 09:00 - 10:00 | 0 | 0 | 0 | 0 |
| 29.09.2019 10:00 - 11:00 | 0 | 0 | 0 | 0 |
| 29.09.2019 11:00 - 12:00 | 0 | 0 | 0 | 0 |
| 29.09.2019 12:00 - 13:00 | 0 | 0 | 0 | 0 |
| 29.09.2019 13:00 - 14:00 | 0 | 0 | 0 | 0 |
| 29.09.2019 14:00 - 15:00 | 0 | 0 | 0 | 0 |
| 29.09.2019 15:00 - 16:00 | 0 | 0 | 0 | 0 |
| 29.09.2019 16:00 - 17:00 | 0 | 0 | 0 | 0 |
| 29.09.2019 17:00 - 18:00 | 0 | 0 | 0 | 0 |
| 29.09.2019 18:00 - 19:00 | 0 | 0 | 0 | 0 |
| 29.09.2019 19:00 - 20:00 | 0 | 0 | 0 | 0 |
| 29.09.2019 20:00 - 21:00 | 0 | 0 | 0 | 0 |
| 29.09.2019 21:00 - 22:00 | 0 | 0 | 0 | 0 |
| 29.09.2019 22:00 - 23:00 | 0 | 0 | 0 | 0 |
| 29.09.2019 23:00 - 24:00 | 0 | 0 | 0 | 0 |
| 30.09.2019 00:00 - 01:00 | 0 | 0 | 0 | 0 |
| 30.09.2019 01:00 - 02:00 | 0 | 0 | 0 | 0 |
| 30.09.2019 02:00 - 03:00 | 0 | 0 | 0 | 0 |
| 30.09.2019 03:00 - 04:00 | 0 | 0 | 0 | 0 |
| 30.09.2019 04:00 - 05:00 | 0 | 0 | 0 | 0 |
| 30.09.2019 05:00 - 06:00 | 0 | 0 | 0 | 0 |
| 30.09.2019 06:00 - 07:00 | 0 | 0 | 0 | 0 |
| 30.09.2019 07:00 - 08:00 | 0 | 0 | 0 | 0 |
| 30.09.2019 08:00 - 09:00 | 0 | 0 | 0 | 0 |
| 30.09.2019 09:00 - 10:00 | 0 | 0 | 0 | 0 |
| 30.09.2019 10:00 - 11:00 | 0 | 0 | 0 | 0 |
| 30.09.2019 11:00 - 12:00 | 0 | 0 | 0 | 0 |